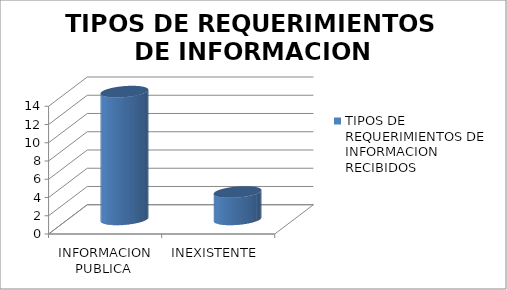
| Category | TIPOS DE REQUERIMIENTOS DE INFORMACION RECIBIDOS |
|---|---|
| INFORMACION PUBLICA  | 14 |
| INEXISTENTE  | 3 |